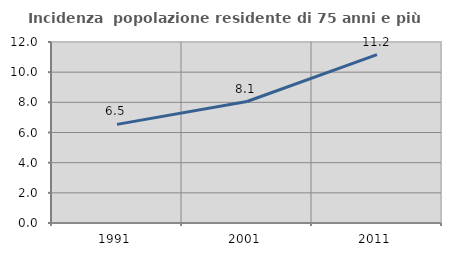
| Category | Incidenza  popolazione residente di 75 anni e più |
|---|---|
| 1991.0 | 6.538 |
| 2001.0 | 8.053 |
| 2011.0 | 11.162 |